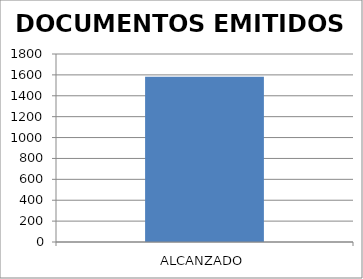
| Category | DOCUMENTOS EMITIDOS |
|---|---|
| ALCANZADO | 1582 |